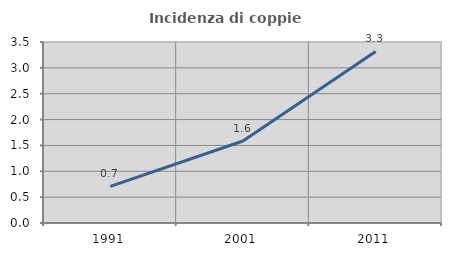
| Category | Incidenza di coppie miste |
|---|---|
| 1991.0 | 0.709 |
| 2001.0 | 1.585 |
| 2011.0 | 3.318 |